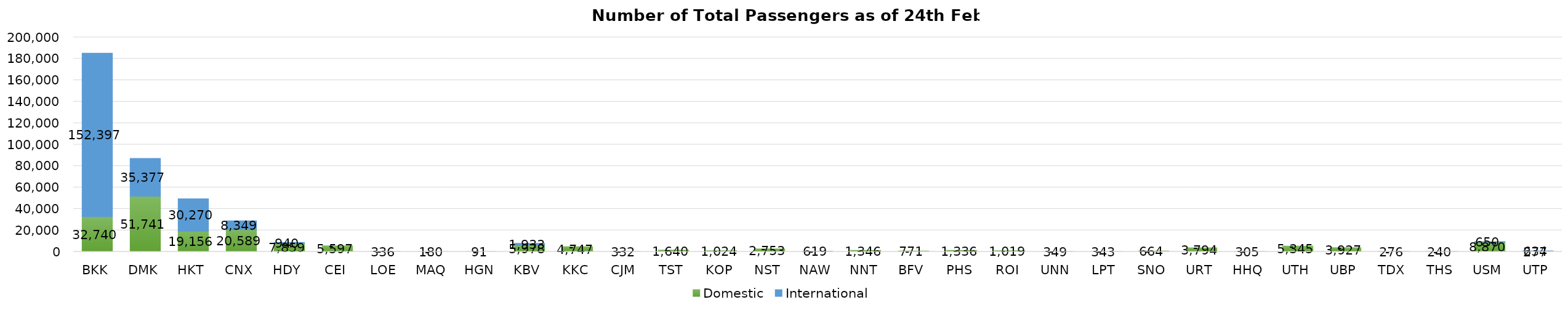
| Category | Domestic | International |
|---|---|---|
| BKK | 32740 | 152397 |
| DMK | 51741 | 35377 |
| HKT | 19156 | 30270 |
| CNX | 20589 | 8349 |
| HDY | 7859 | 940 |
| CEI | 5597 | 0 |
| LOE | 336 | 0 |
| MAQ | 180 | 0 |
| HGN | 91 | 0 |
| KBV | 5978 | 1933 |
| KKC | 4747 | 0 |
| CJM | 332 | 0 |
| TST | 1640 | 0 |
| KOP | 1024 | 0 |
| NST | 2753 | 0 |
| NAW | 619 | 0 |
| NNT | 1346 | 0 |
| BFV | 771 | 0 |
| PHS | 1336 | 0 |
| ROI | 1019 | 0 |
| UNN | 349 | 0 |
| LPT | 343 | 0 |
| SNO | 664 | 0 |
| URT | 3794 | 0 |
| HHQ | 305 | 0 |
| UTH | 5345 | 0 |
| UBP | 3927 | 0 |
| TDX | 276 | 0 |
| THS | 240 | 0 |
| USM | 8870 | 650 |
| UTP | 277 | 634 |